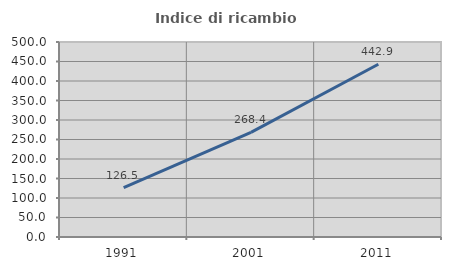
| Category | Indice di ricambio occupazionale  |
|---|---|
| 1991.0 | 126.471 |
| 2001.0 | 268.421 |
| 2011.0 | 442.857 |